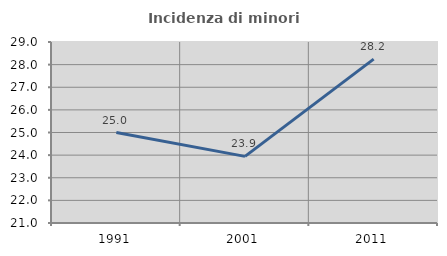
| Category | Incidenza di minori stranieri |
|---|---|
| 1991.0 | 25 |
| 2001.0 | 23.944 |
| 2011.0 | 28.244 |